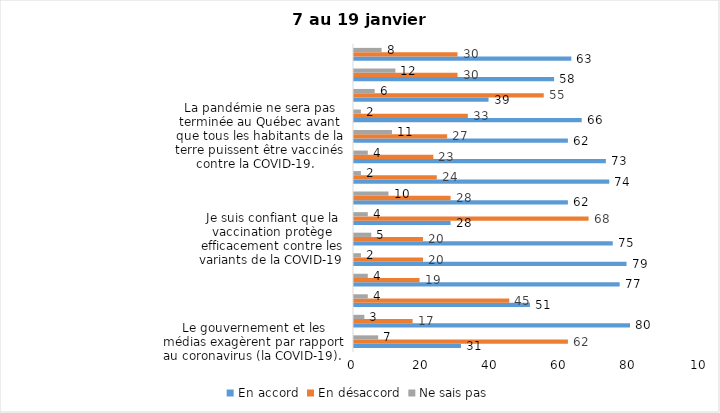
| Category | En accord | En désaccord | Ne sais pas |
|---|---|---|---|
| Le gouvernement et les médias exagèrent par rapport au coronavirus (la COVID-19). | 31 | 62 | 7 |
| J’ai peur que le système de santé soit débordé par les cas de COVID-19. | 80 | 17 | 3 |
| Je suis favorable au maintien du couvre-feu pour les prochaines semaines. | 51 | 45 | 4 |
| Je suis inquiet/inquiète que le nombre de cas augmente en raison des nouveaux variants du virus de la COVID-19. | 77 | 19 | 4 |
| Je suis favorable au passeport vaccinal qui permettrait l'accès à certains lieux ou activités aux personnes vaccinées. | 79 | 20 | 2 |
| Je suis confiant que la vaccination protège efficacement contre les variants de la COVID-19 | 75 | 20 | 5 |
| Je suis favorable à ce que le port du masque ne soit plus obligatoire au Québec. | 28 | 68 | 4 |
| J'ai peur que la reprise des cours en présentiel dans les écoles primaires et secondaires génère une augmentation des cas de COVID-19 | 62 | 28 | 10 |
| Je crois que le passeport vaccinal devrait être requis pour davantage de services et commerces (ex. : spas, centre d’achats, centre de soins personnels. | 74 | 24 | 2 |
| Les personnes non adéquatement vaccinées contre la COVID-19 sont responsables des nouveaux cas et hospitalisations et contribuent à la prolongation de la pandémie au Québec. | 73 | 23 | 4 |
| La pandémie ne sera pas terminée au Québec avant que tous les habitants de la terre puissent être vaccinés contre la COVID-19.   | 62 | 27 | 11 |
| Je suis inconfortable d’être en contact avec une personne non vaccinée contre la COVID-19 | 66 | 33 | 2 |
| Je n'ai pas peur du variant Omicron, car il semble moins dangereux pour la santé. | 39 | 55 | 6 |
| La vaccination obligatoire contre la COVID-19 mettrait fin à la pandémie. | 58 | 30 | 12 |
| Je suis favorable à ce que les personnes non vaccinées paient une taxe supplémentaire (contribution santé). | 63 | 30 | 8 |